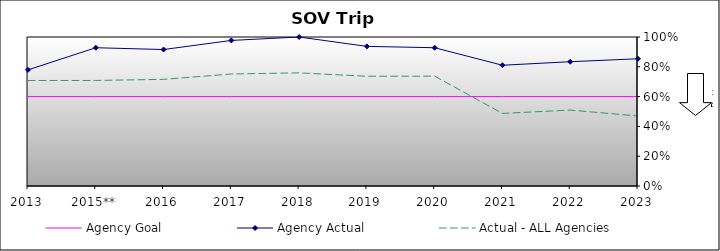
| Category | Agency Goal | Agency Actual | Actual - ALL Agencies |
|---|---|---|---|
| 2013 | 0.6 | 0.78 | 0.708 |
| 2015** | 0.6 | 0.928 | 0.708 |
| 2016 | 0.6 | 0.916 | 0.716 |
| 2017 | 0.6 | 0.977 | 0.752 |
| 2018 | 0.6 | 1 | 0.759 |
| 2019 | 0.6 | 0.937 | 0.736 |
| 2020 | 0.6 | 0.928 | 0.737 |
| 2021 | 0.6 | 0.81 | 0.487 |
| 2022 | 0.6 | 0.834 | 0.509 |
| 2023 | 0.6 | 0.854 | 0.47 |